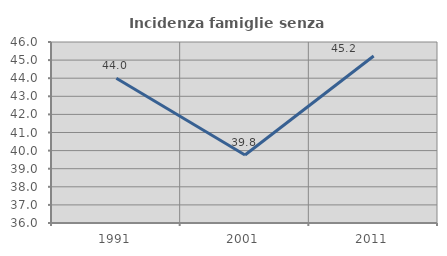
| Category | Incidenza famiglie senza nuclei |
|---|---|
| 1991.0 | 44 |
| 2001.0 | 39.759 |
| 2011.0 | 45.228 |